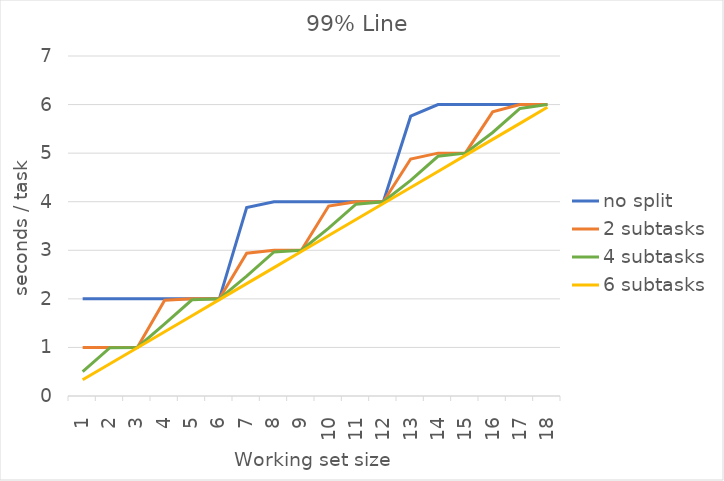
| Category | no split | 2 subtasks | 4 subtasks | 6 subtasks |
|---|---|---|---|---|
| 1.0 | 2 | 1 | 0.5 | 0.333 |
| 2.0 | 2 | 1 | 0.995 | 0.663 |
| 3.0 | 2 | 1 | 1 | 0.993 |
| 4.0 | 2 | 1.97 | 1.485 | 1.323 |
| 5.0 | 2 | 2 | 1.98 | 1.653 |
| 6.0 | 2 | 2 | 2 | 1.983 |
| 7.0 | 3.88 | 2.94 | 2.47 | 2.313 |
| 8.0 | 4 | 3 | 2.965 | 2.643 |
| 9.0 | 4 | 3 | 3 | 2.973 |
| 10.0 | 4 | 3.91 | 3.455 | 3.303 |
| 11.0 | 4 | 4 | 3.95 | 3.633 |
| 12.0 | 4 | 4 | 4 | 3.963 |
| 13.0 | 5.76 | 4.88 | 4.44 | 4.293 |
| 14.0 | 6 | 5 | 4.935 | 4.623 |
| 15.0 | 6 | 5 | 5 | 4.953 |
| 16.0 | 6 | 5.85 | 5.425 | 5.283 |
| 17.0 | 6 | 6 | 5.92 | 5.613 |
| 18.0 | 6 | 6 | 6 | 5.943 |